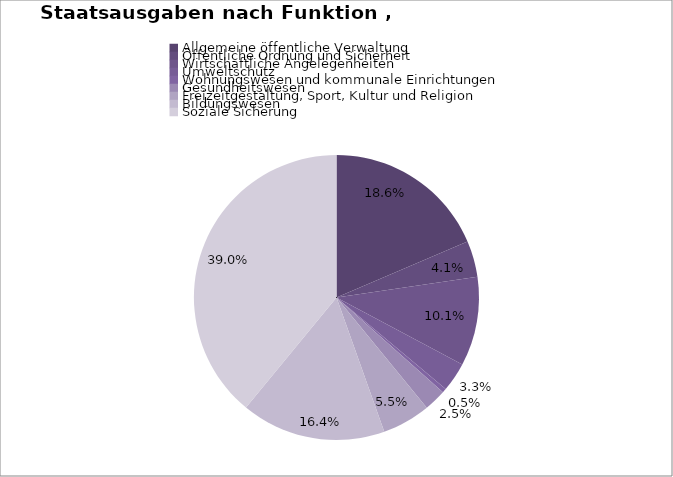
| Category | Series 0 | Series 1 |
|---|---|---|
| Allgemeine öffentliche Verwaltung | 291.9 | 230.1 |
| Öffentliche Ordnung und Sicherheit | 64.6 | 57.5 |
| Wirtschaftliche Angelegenheiten | 159.1 | 104.9 |
| Umweltschutz | 52.2 | 10.9 |
| Wohnungswesen und kommunale Einrichtungen | 7.4 | 4 |
| Gesundheitswesen | 39.3 | 39 |
| Freizeitgestaltung, Sport, Kultur und Religion | 86.2 | 44.2 |
| Bildungswesen | 257.8 | 203.5 |
| Soziale Sicherung | 614 | 148.8 |